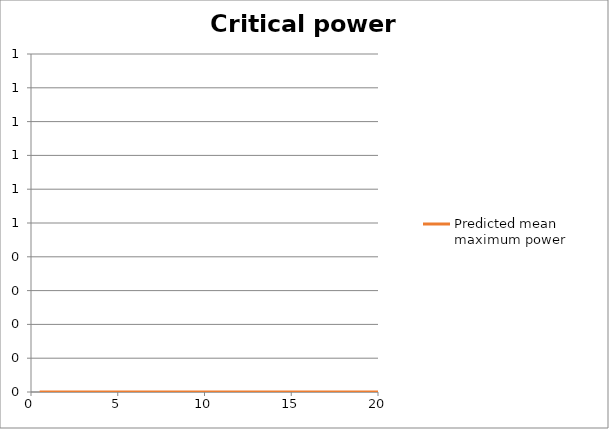
| Category | Predicted mean maximum power |
|---|---|
| 0.5 | 0 |
| 1.0 | 0 |
| 2.0 | 0 |
| 3.0 | 0 |
| 4.0 | 0 |
| 5.0 | 0 |
| 6.0 | 0 |
| 7.0 | 0 |
| 8.0 | 0 |
| 9.0 | 0 |
| 10.0 | 0 |
| 11.0 | 0 |
| 12.0 | 0 |
| 13.0 | 0 |
| 14.0 | 0 |
| 15.0 | 0 |
| 16.0 | 0 |
| 17.0 | 0 |
| 18.0 | 0 |
| 19.0 | 0 |
| 20.0 | 0 |
| 21.0 | 0 |
| 22.0 | 0 |
| 23.0 | 0 |
| 24.0 | 0 |
| 25.0 | 0 |
| 26.0 | 0 |
| 27.0 | 0 |
| 28.0 | 0 |
| 29.0 | 0 |
| 30.0 | 0 |
| 31.0 | 0 |
| 32.0 | 0 |
| 33.0 | 0 |
| 34.0 | 0 |
| 35.0 | 0 |
| 36.0 | 0 |
| 37.0 | 0 |
| 38.0 | 0 |
| 39.0 | 0 |
| 40.0 | 0 |
| 41.0 | 0 |
| 42.0 | 0 |
| 43.0 | 0 |
| 44.0 | 0 |
| 45.0 | 0 |
| 46.0 | 0 |
| 47.0 | 0 |
| 48.0 | 0 |
| 49.0 | 0 |
| 50.0 | 0 |
| 51.0 | 0 |
| 52.0 | 0 |
| 53.0 | 0 |
| 54.0 | 0 |
| 55.0 | 0 |
| 56.0 | 0 |
| 57.0 | 0 |
| 58.0 | 0 |
| 59.0 | 0 |
| 60.0 | 0 |